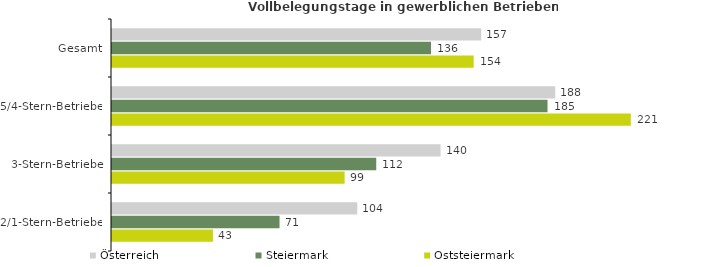
| Category | Österreich | Steiermark | Oststeiermark |
|---|---|---|---|
| Gesamt | 156.946 | 135.634 | 153.783 |
| 5/4-Stern-Betriebe | 188.443 | 185.178 | 220.586 |
| 3-Stern-Betriebe | 139.696 | 112.345 | 98.903 |
| 2/1-Stern-Betriebe | 104.286 | 71.229 | 42.904 |